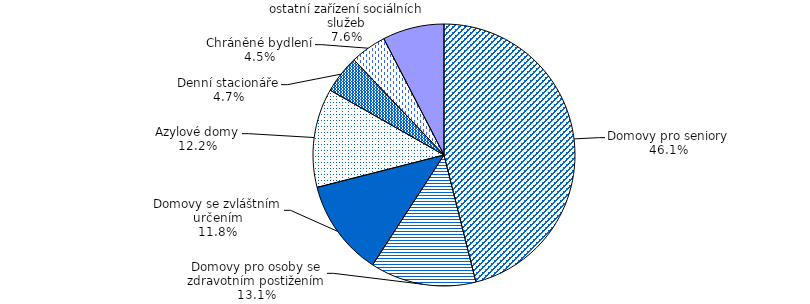
| Category | Series 0 |
|---|---|
| Domovy pro seniory | 4818 |
| Domovy pro osoby se zdravotním postižením | 1369 |
| Domovy se zvláštním určením | 1239 |
| Azylové domy | 1277 |
| Denní stacionáře | 492 |
| Chráněné bydlení | 466 |
| ostatní zařízení sociálních služeb | 795 |